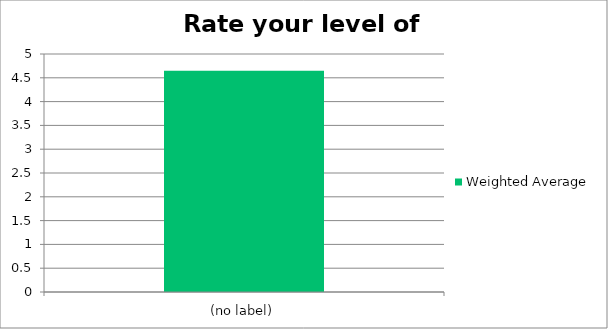
| Category | Weighted Average |
|---|---|
| (no label) | 4.65 |